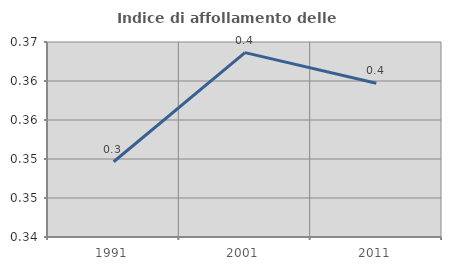
| Category | Indice di affollamento delle abitazioni  |
|---|---|
| 1991.0 | 0.35 |
| 2001.0 | 0.364 |
| 2011.0 | 0.36 |